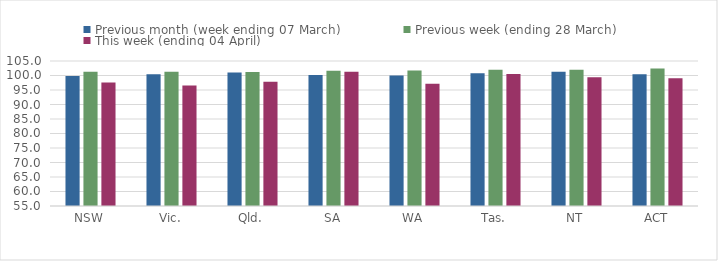
| Category | Previous month (week ending 07 March) | Previous week (ending 28 March) | This week (ending 04 April) |
|---|---|---|---|
| NSW | 99.865 | 101.319 | 97.547 |
| Vic. | 100.474 | 101.272 | 96.56 |
| Qld. | 101.061 | 101.229 | 97.846 |
| SA | 100.204 | 101.609 | 101.269 |
| WA | 100.008 | 101.756 | 97.148 |
| Tas. | 100.764 | 102.006 | 100.546 |
| NT | 101.33 | 101.963 | 99.43 |
| ACT | 100.424 | 102.439 | 99.081 |